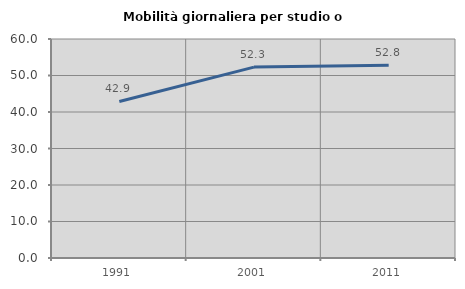
| Category | Mobilità giornaliera per studio o lavoro |
|---|---|
| 1991.0 | 42.891 |
| 2001.0 | 52.306 |
| 2011.0 | 52.83 |